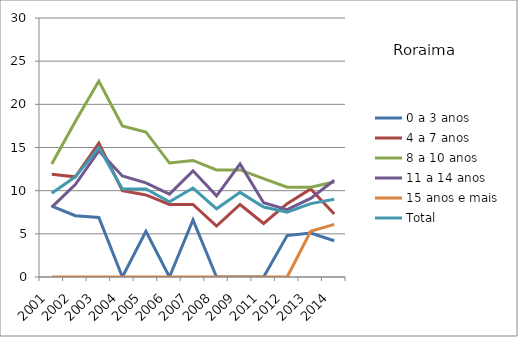
| Category | 0 a 3 anos | 4 a 7 anos | 8 a 10 anos | 11 a 14 anos | 15 anos e mais | Total |
|---|---|---|---|---|---|---|
| 2001.0 | 8.2 | 11.9 | 13.1 | 8.1 | 0 | 9.7 |
| 2002.0 | 7.1 | 11.6 | 18 | 10.7 | 0 | 11.6 |
| 2003.0 | 6.9 | 15.5 | 22.7 | 14.6 | 0 | 15 |
| 2004.0 | 0 | 10 | 17.5 | 11.7 | 0 | 10.2 |
| 2005.0 | 5.3 | 9.5 | 16.8 | 10.9 | 0 | 10.2 |
| 2006.0 | 0 | 8.4 | 13.2 | 9.6 | 0 | 8.7 |
| 2007.0 | 6.6 | 8.4 | 13.5 | 12.3 | 0 | 10.3 |
| 2008.0 | 0 | 5.9 | 12.4 | 9.4 | 0 | 7.9 |
| 2009.0 | 0 | 8.4 | 12.4 | 13.1 | 0 | 9.8 |
| 2011.0 | 0 | 6.2 | 11.4 | 8.6 | 0 | 8.1 |
| 2012.0 | 4.8 | 8.5 | 10.4 | 7.8 | 0 | 7.5 |
| 2013.0 | 5.1 | 10.2 | 10.4 | 9.1 | 5.3 | 8.5 |
| 2014.0 | 4.2 | 7.3 | 11 | 11.2 | 6.1 | 9 |